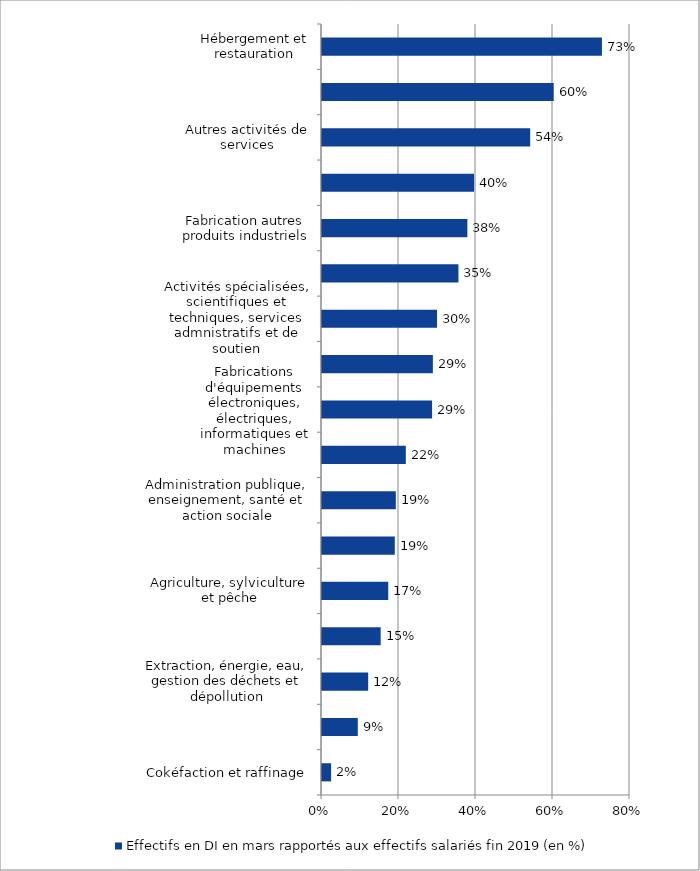
| Category | Effectifs en DI en mars rapportés aux effectifs salariés fin 2019 (en %) |
|---|---|
| Cokéfaction et raffinage | 0.024 |
| Activités financières et d'assurance | 0.093 |
| Extraction, énergie, eau, gestion des déchets et dépollution | 0.12 |
| Information et communication | 0.152 |
| Agriculture, sylviculture et pêche | 0.172 |
| Fabrication d'aliments, boissons et produits à base de tabac | 0.189 |
| Administration publique, enseignement, santé et action sociale | 0.192 |
| Transports et entreposage | 0.218 |
| Fabrications d'équipements électroniques, électriques, informatiques et machines | 0.286 |
| Activités immobilières | 0.288 |
| Activités spécialisées, scientifiques et techniques, services admnistratifs et de soutien | 0.299 |
| Fabrication de matériels de transport | 0.354 |
| Fabrication autres produits industriels | 0.378 |
| Commerce | 0.395 |
| Autres activités de services | 0.541 |
| Construction | 0.602 |
| Hébergement et restauration | 0.727 |